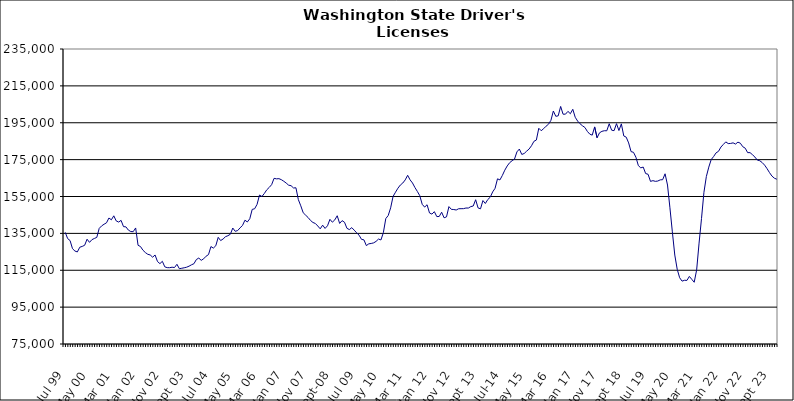
| Category | Series 0 |
|---|---|
| Jul 99 | 135560 |
| Aug 99 | 132182 |
| Sep 99 | 131104 |
| Oct 99 | 126694 |
| Nov 99 | 125425 |
| Dec 99 | 124927 |
| Jan 00 | 127499 |
| Feb 00 | 127927 |
| Mar 00 | 128547 |
| Apr 00 | 131834 |
| May 00 | 130120 |
| Jun 00 | 131595 |
| Jul 00 | 132236 |
| Aug 00 | 132819 |
| Sep 00 | 137711 |
| Oct 00 | 139063 |
| Nov 00 | 139952 |
| Dec 00 | 140732 |
| Jan 01 | 143338 |
| Feb 01 | 142359 |
| Mar 01 | 144523 |
| Apr 01 | 141758 |
| May 01 | 141135 |
| Jun 01 | 142064 |
| Jul 01 | 138646 |
| Aug 01 | 138530 |
| Sep 01 | 136784 |
| Oct 01 | 135996 |
| Nov 01 | 135917 |
| Dec 01 | 137940 |
| Jan 02 | 128531 |
| Feb 02 | 127848 |
| Mar 02 | 125876 |
| Apr 02 | 124595 |
| May 02 | 123660 |
| Jun 02 | 123282 |
| Jul 02 | 122089 |
| Aug 02 | 123279 |
| Sep 02 | 119727 |
| Oct 02 | 118588 |
| Nov 02 | 119854 |
| Dec 02 | 116851 |
| Jan 03 | 116407 |
| Feb 03 | 116382 |
| Mar 03 | 116648 |
| Apr 03 | 116471 |
| May 03 | 118231 |
| Jun 03 | 115831 |
| Jul 03 | 116082 |
| Aug 03 | 116341 |
| Sep 03 | 116653 |
| Oct 03 | 117212 |
| Nov 03 | 117962 |
| Dec 03 | 118542 |
| Jan 04 | 120817 |
| Feb 04 | 121617 |
| Mar 04 | 120369 |
| Apr 04 | 121200 |
| May 04 | 122609 |
| Jun 04 | 123484 |
| Jul 04 | 127844 |
| Aug 04 | 127025 |
| Sep 04 | 128273 |
| Oct 04 | 132853 |
| Nov 04 | 131106 |
| Dec 04 | 131935 |
| Jan 05 | 133205 |
| Feb 05 | 133736 |
| Mar 05 | 134528 |
| Apr 05 | 137889 |
| May 05 | 136130 |
| Jun 05 | 136523 |
| Jul 05 | 137997 |
| Aug 05 | 139294 |
| Sep 05 | 142140 |
| Oct 05 | 141192 |
| Nov 05 | 142937 |
| Dec 05 | 148013 |
| Jan 06 | 148341 |
| Feb 06 | 150744 |
| Mar 06 | 155794 |
| Apr 06 | 154984 |
| May 06 | 156651 |
| Jun 06 | 158638 |
| Jul 06 | 159911 |
| Aug 06 | 161445 |
| Sep 06 | 164852 |
| Oct 06 | 164570 |
| Nov 06 | 164679 |
| Dec 06 | 164127 |
| Jan 07 | 163271 |
| Feb 07 | 162273 |
| Mar 07 | 161140 |
| Apr 07 | 160860 |
| May 07 | 159633 |
| Jun 07 | 159724 |
| Jul 07 | 153303 |
| Aug 07 | 149939 |
| Sep 07 | 146172 |
| Oct 07 | 144876 |
| Nov 07 | 143613 |
| Dec 07 | 142022 |
| Jan 08 | 140909 |
| Feb 08 | 140368 |
| Mar 08 | 138998 |
| Apr 08 | 137471 |
| May 08 | 139453 |
| Jun 08 | 137680 |
| Jul 08 | 139120 |
| Aug 08 | 142612 |
| Sep-08 | 141071 |
| Oct 08 | 142313 |
| Nov 08 | 144556 |
| Dec 08 | 140394 |
| Jan 09 | 141903 |
| Feb 09 | 141036 |
| Mar 09 | 137751 |
| Apr 09 | 137060 |
| May 09 | 138101 |
| Jun 09 | 136739 |
| Jul 09 | 135317 |
| Aug 09 | 134020 |
| Sep 09 | 131756 |
| Oct 09 | 131488 |
| Nov 09 | 128370 |
| Dec 09 | 129323 |
| Jan 10 | 129531 |
| Feb 10 | 129848 |
| Mar 10 | 130654 |
| Apr 10 | 131929 |
| May 10 | 131429 |
| Jun 10 | 135357 |
| Jul 10 | 143032 |
| Aug 10 | 144686 |
| Sep 10 | 148856 |
| Oct 10 | 155042 |
| Nov 10 | 157328 |
| Dec 10 | 159501 |
| Jan 11 | 161221 |
| Feb 11 | 162312 |
| Mar 11 | 163996 |
| Apr 11 | 166495 |
| May 11 | 164040 |
| Jun 11 | 162324 |
| Jul 11 | 159862 |
| Aug 11 | 157738 |
| Sep 11 | 155430 |
| Oct 11 | 150762 |
| Nov 11 | 149255 |
| Dec 11 | 150533 |
| Jan 12 | 146068 |
| Feb 12 | 145446 |
| Mar 12 | 146788 |
| Apr 12 | 144110 |
| May 12 | 144162 |
| Jun 12 | 146482 |
| Jul 12 | 143445 |
| Aug 12 | 143950 |
| Sep 12 | 149520 |
| Oct 12 | 148033 |
| Nov 12 | 147926 |
| Dec 12 | 147674 |
| Jan 13 | 148360 |
| Feb-13 | 148388 |
| Mar-13 | 148414 |
| Apr 13 | 148749 |
| May 13 | 148735 |
| Jun-13 | 149521 |
| Jul 13 | 149837 |
| Aug 13 | 153252 |
| Sep 13 | 148803 |
| Oct 13 | 148315 |
| Nov 13 | 152804 |
| Dec 13 | 151209 |
| Jan 14 | 153357 |
| Feb-14 | 154608 |
| Mar 14 | 157479 |
| Apr 14 | 159441 |
| May 14 | 164591 |
| Jun 14 | 163995 |
| Jul-14 | 166411 |
| Aug-14 | 169272 |
| Sep 14 | 171565 |
| Oct 14 | 173335 |
| Nov 14 | 174406 |
| Dec 14 | 175302 |
| Jan 15 | 179204 |
| Feb 15 | 180737 |
| Mar 15 | 177810 |
| Apr-15 | 178331 |
| May 15 | 179601 |
| Jun-15 | 180729 |
| Jul 15 | 182540 |
| Aug 15 | 184924 |
| Sep 15 | 185620 |
| Oct 15 | 192002 |
| Nov 15 | 190681 |
| Dec 15 | 191795 |
| Jan 16 | 193132 |
| Feb 16 | 194206 |
| Mar 16 | 196319 |
| Apr 16 | 201373 |
| May 16 | 198500 |
| Jun 16 | 198743 |
| Jul 16 | 203841 |
| Aug 16 | 199630 |
| Sep 16 | 199655 |
| Oct 16 | 201181 |
| Nov 16 | 199888 |
| Dec 16 | 202304 |
| Jan 17 | 197977 |
| Feb 17 | 195889 |
| Mar 17 | 194438 |
| Apr 17 | 193335 |
| May 17 | 192430 |
| Jun 17 | 190298 |
| Jul 17 | 188832 |
| Aug 17 | 188264 |
| Sep 17 | 192738 |
| Oct 17 | 186856 |
| Nov 17 | 189537 |
| Dec 17 | 190341 |
| Jan 18 | 190670 |
| Feb 18 | 190645 |
| Mar 18 | 194476 |
| Apr 18 | 190971 |
| May 18 | 190707 |
| Jun 18 | 194516 |
| Jul 18 | 190783 |
| Aug 18 | 194390 |
| Sep 18 | 187831 |
| Oct 18 | 187188 |
| Nov 18 | 184054 |
| Dec 18 | 179347 |
| Jan 19 | 178958 |
| Feb 19 | 176289 |
| Mar 19 | 171747 |
| Apr 19 | 170532 |
| May 19 | 170967 |
| Jun 19 | 167444 |
| Jul 19 | 167059 |
| Aug 19 | 163194 |
| Sep 19 | 163599 |
| Oct 19 | 163212 |
| Nov 19 | 163388 |
| Dec 19 | 164024 |
| Jan 20 | 164114 |
| Feb 20 | 167320 |
| Mar 20 | 161221 |
| Apr 20 | 148866 |
| May 20 | 135821 |
| Jun 20 | 123252 |
| Jul 20 | 115526 |
| Aug 20 | 110940 |
| Sep 20 | 109099 |
| Oct 20 | 109566 |
| Nov 20 | 109488 |
| Dec 20 | 111658 |
| Jan 21 | 110070 |
| Feb 21 | 108491 |
| Mar 21 | 115176 |
| Apr 21 | 129726 |
| May 21 | 143052 |
| Jun 21 | 157253 |
| Jul 21 | 165832 |
| Aug 21 | 170937 |
| Sep 21 | 175042 |
| Oct 21 | 176696 |
| Nov 21 | 178677 |
| Dec 21 | 179501 |
| Jan 22 | 181825 |
| Feb 22 | 183258 |
| Mar 22 | 184618 |
| Apr 22 | 183710 |
| May 22 | 183784 |
| Jun 22 | 184101 |
| Jul 22 | 183443 |
| Aug 22 | 184475 |
| Sep 22 | 183902 |
| Oct 22 | 181994 |
| Nov 22 | 181207 |
| Dec 22 | 178793 |
| Jan 23 | 178782 |
| Feb 23 | 177647 |
| Mar 23 | 176386 |
| Apr 23 | 174729 |
| May 23 | 174390 |
| Jun 23 | 173391 |
| Jul 23 | 171988 |
| Aug 23 | 170100 |
| Sep 23 | 167953 |
| Oct 23 | 166088 |
| Nov 23 | 164934 |
| Dec 23 | 164371 |